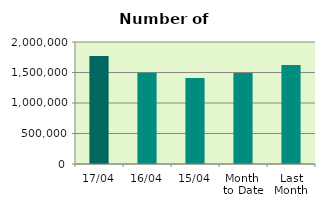
| Category | Series 0 |
|---|---|
| 17/04 | 1768934 |
| 16/04 | 1496228 |
| 15/04 | 1410868 |
| Month 
to Date | 1491074 |
| Last
Month | 1624932.286 |